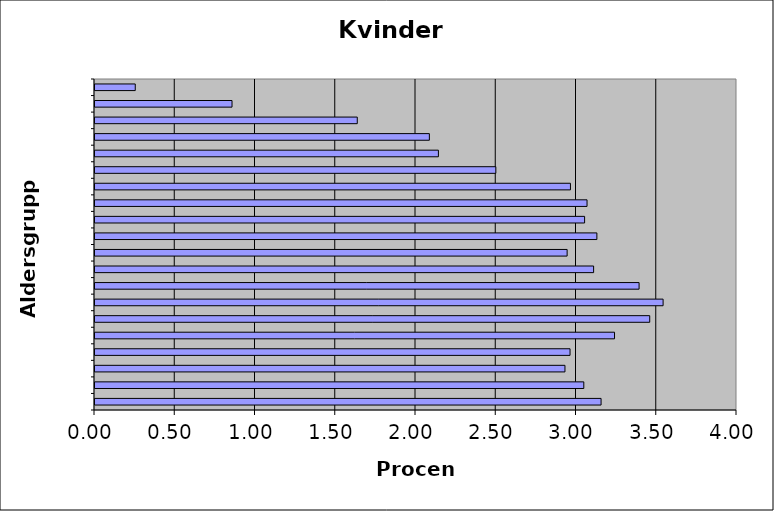
| Category | Kvinder |
|---|---|
|  | 3.153 |
|  | 3.046 |
|  | 2.928 |
|  | 2.96 |
|  | 3.237 |
|  | 3.456 |
|  | 3.54 |
|  | 3.39 |
|  | 3.107 |
|  | 2.942 |
|  | 3.127 |
|  | 3.05 |
|  | 3.066 |
|  | 2.962 |
|  | 2.498 |
|  | 2.14 |
|  | 2.083 |
|  | 1.634 |
|  | 0.854 |
|  | 0.251 |